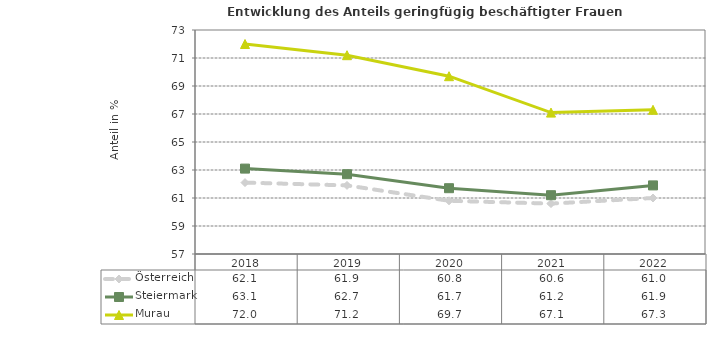
| Category | Österreich | Steiermark | Murau |
|---|---|---|---|
| 2022.0 | 61 | 61.9 | 67.3 |
| 2021.0 | 60.6 | 61.2 | 67.1 |
| 2020.0 | 60.8 | 61.7 | 69.7 |
| 2019.0 | 61.9 | 62.7 | 71.2 |
| 2018.0 | 62.1 | 63.1 | 72 |